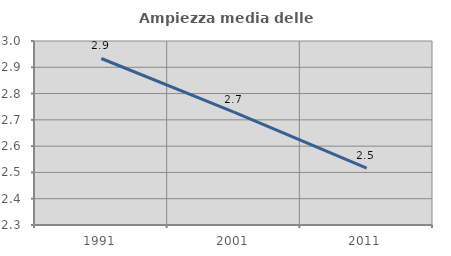
| Category | Ampiezza media delle famiglie |
|---|---|
| 1991.0 | 2.933 |
| 2001.0 | 2.729 |
| 2011.0 | 2.516 |